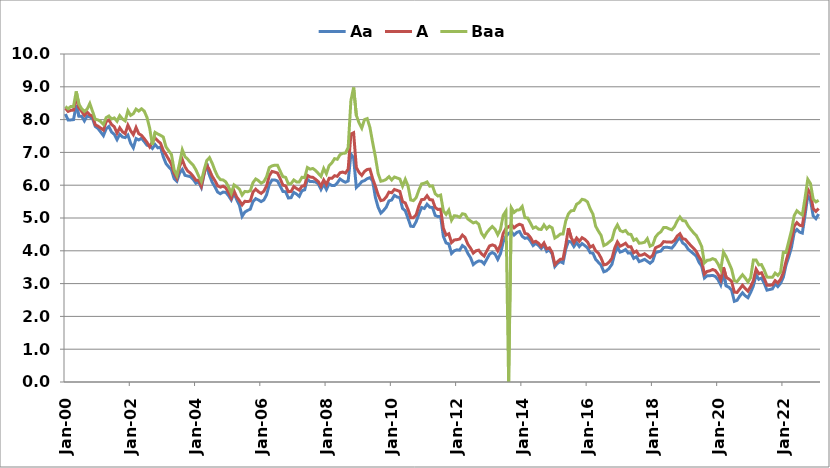
| Category | Aa | A | Baa |
|---|---|---|---|
| 2000-01-01 | 8.17 | 8.35 | 8.4 |
| 2000-02-01 | 7.99 | 8.25 | 8.33 |
| 2000-03-01 | 7.99 | 8.28 | 8.4 |
| 2000-04-01 | 8 | 8.29 | 8.4 |
| 2000-05-01 | 8.44 | 8.7 | 8.86 |
| 2000-06-01 | 8.1 | 8.36 | 8.47 |
| 2000-07-01 | 8.1 | 8.25 | 8.33 |
| 2000-08-01 | 7.96 | 8.13 | 8.25 |
| 2000-09-01 | 8.11 | 8.23 | 8.32 |
| 2000-10-01 | 8.08 | 8.14 | 8.49 |
| 2000-11-01 | 8.03 | 8.11 | 8.25 |
| 2000-12-01 | 7.79 | 7.84 | 8.01 |
| 2001-01-01 | 7.73 | 7.8 | 7.99 |
| 2001-02-01 | 7.62 | 7.74 | 7.94 |
| 2001-03-01 | 7.51 | 7.68 | 7.85 |
| 2001-04-01 | 7.72 | 7.94 | 8.06 |
| 2001-05-01 | 7.79 | 7.99 | 8.11 |
| 2001-06-01 | 7.62 | 7.85 | 8.02 |
| 2001-07-01 | 7.55 | 7.78 | 8.05 |
| 2001-08-01 | 7.39 | 7.59 | 7.95 |
| 2001-09-01 | 7.55 | 7.75 | 8.12 |
| 2001-10-01 | 7.47 | 7.63 | 8.02 |
| 2001-11-01 | 7.45 | 7.57 | 7.96 |
| 2001-12-01 | 7.53 | 7.83 | 8.27 |
| 2002-01-01 | 7.28 | 7.66 | 8.13 |
| 2002-02-01 | 7.14 | 7.54 | 8.18 |
| 2002-03-01 | 7.42 | 7.76 | 8.32 |
| 2002-04-01 | 7.38 | 7.57 | 8.26 |
| 2002-05-01 | 7.43 | 7.52 | 8.33 |
| 2002-06-01 | 7.33 | 7.42 | 8.26 |
| 2002-07-01 | 7.22 | 7.31 | 8.07 |
| 2002-08-01 | 7.2 | 7.17 | 7.74 |
| 2002-09-01 | 7.12 | 7.32 | 7.23 |
| 2002-10-01 | 7.24 | 7.44 | 7.61 |
| 2002-11-01 | 7.14 | 7.35 | 7.56 |
| 2002-12-01 | 7.16 | 7.28 | 7.52 |
| 2003-01-01 | 6.87 | 7.06 | 7.47 |
| 2003-02-01 | 6.66 | 6.93 | 7.17 |
| 2003-03-01 | 6.56 | 6.79 | 7.05 |
| 2003-04-01 | 6.47 | 6.64 | 6.94 |
| 2003-05-01 | 6.2 | 6.36 | 6.47 |
| 2003-06-01 | 6.12 | 6.21 | 6.3 |
| 2003-07-01 | 6.37 | 6.57 | 6.67 |
| 2003-08-01 | 6.48 | 6.78 | 7.08 |
| 2003-09-01 | 6.3 | 6.56 | 6.87 |
| 2003-10-01 | 6.28 | 6.43 | 6.79 |
| 2003-11-01 | 6.26 | 6.37 | 6.69 |
| 2003-12-01 | 6.18 | 6.27 | 6.61 |
| 2004-01-01 | 6.06 | 6.15 | 6.47 |
| 2004-02-01 | 6.1 | 6.15 | 6.28 |
| 2004-03-01 | 5.93 | 5.97 | 6.12 |
| 2004-04-01 | 6.33 | 6.35 | 6.46 |
| 2004-05-01 | 6.66 | 6.62 | 6.75 |
| 2004-06-01 | 6.3 | 6.46 | 6.84 |
| 2004-07-01 | 6.09 | 6.27 | 6.67 |
| 2004-08-01 | 5.95 | 6.14 | 6.45 |
| 2004-09-01 | 5.79 | 5.98 | 6.27 |
| 2004-10-01 | 5.74 | 5.94 | 6.17 |
| 2004-11-01 | 5.79 | 5.97 | 6.16 |
| 2004-12-01 | 5.78 | 5.92 | 6.1 |
| 2005-01-01 | 5.68 | 5.78 | 5.95 |
| 2005-02-01 | 5.55 | 5.61 | 5.76 |
| 2005-03-01 | 5.76 | 5.83 | 6.01 |
| 2005-04-01 | 5.56 | 5.64 | 5.95 |
| 2005-05-01 | 5.39 | 5.53 | 5.88 |
| 2005-06-01 | 5.05 | 5.4 | 5.7 |
| 2005-07-01 | 5.18 | 5.51 | 5.81 |
| 2005-08-01 | 5.23 | 5.5 | 5.8 |
| 2005-09-01 | 5.27 | 5.52 | 5.83 |
| 2005-10-01 | 5.5 | 5.79 | 6.08 |
| 2005-11-01 | 5.59 | 5.88 | 6.19 |
| 2005-12-01 | 5.55 | 5.8 | 6.14 |
| 2006-01-01 | 5.5 | 5.75 | 6.06 |
| 2006-02-01 | 5.55 | 5.82 | 6.11 |
| 2006-03-01 | 5.71 | 5.98 | 6.26 |
| 2006-04-01 | 6.02 | 6.29 | 6.54 |
| 2006-05-01 | 6.16 | 6.42 | 6.59 |
| 2006-06-01 | 6.16 | 6.4 | 6.61 |
| 2006-07-01 | 6.13 | 6.37 | 6.61 |
| 2006-08-01 | 5.97 | 6.2 | 6.43 |
| 2006-09-01 | 5.81 | 6 | 6.26 |
| 2006-10-01 | 5.8 | 5.98 | 6.24 |
| 2006-11-01 | 5.61 | 5.8 | 6.04 |
| 2006-12-01 | 5.62 | 5.81 | 6.05 |
| 2007-01-01 | 5.78 | 5.96 | 6.16 |
| 2007-02-01 | 5.73 | 5.9 | 6.1 |
| 2007-03-01 | 5.66 | 5.85 | 6.1 |
| 2007-04-01 | 5.83 | 5.97 | 6.24 |
| 2007-05-01 | 5.86 | 5.99 | 6.23 |
| 2007-06-01 | 6.18 | 6.3 | 6.54 |
| 2007-07-01 | 6.11 | 6.25 | 6.49 |
| 2007-08-01 | 6.11 | 6.24 | 6.51 |
| 2007-09-01 | 6.1 | 6.18 | 6.45 |
| 2007-10-01 | 6.04 | 6.11 | 6.36 |
| 2007-11-01 | 5.87 | 5.97 | 6.27 |
| 2007-12-01 | 6.03 | 6.16 | 6.51 |
| 2008-01-01 | 5.87 | 6.02 | 6.35 |
| 2008-02-01 | 6.04 | 6.21 | 6.6 |
| 2008-03-01 | 5.99 | 6.21 | 6.68 |
| 2008-04-01 | 5.99 | 6.29 | 6.81 |
| 2008-05-01 | 6.07 | 6.27 | 6.79 |
| 2008-06-01 | 6.19 | 6.38 | 6.93 |
| 2008-07-01 | 6.13 | 6.4 | 6.97 |
| 2008-08-01 | 6.09 | 6.37 | 6.98 |
| 2008-09-01 | 6.13 | 6.49 | 7.15 |
| 2008-10-01 | 6.95 | 7.56 | 8.58 |
| 2008-11-01 | 6.83 | 7.6 | 8.98 |
| 2008-12-01 | 5.93 | 6.54 | 8.13 |
| 2009-01-01 | 6.01 | 6.39 | 7.9 |
| 2009-02-01 | 6.11 | 6.3 | 7.74 |
| 2009-03-01 | 6.14 | 6.42 | 8 |
| 2009-04-01 | 6.2 | 6.48 | 8.03 |
| 2009-05-01 | 6.23 | 6.49 | 7.76 |
| 2009-06-01 | 6.13 | 6.2 | 7.3 |
| 2009-07-01 | 5.63 | 5.97 | 6.87 |
| 2009-08-01 | 5.33 | 5.71 | 6.36 |
| 2009-09-01 | 5.15 | 5.53 | 6.12 |
| 2009-10-01 | 5.23 | 5.55 | 6.14 |
| 2009-11-01 | 5.33 | 5.64 | 6.18 |
| 2009-12-01 | 5.52 | 5.79 | 6.26 |
| 2010-01-01 | 5.55 | 5.77 | 6.16 |
| 2010-02-01 | 5.69 | 5.87 | 6.25 |
| 2010-03-01 | 5.64 | 5.84 | 6.22 |
| 2010-04-01 | 5.62 | 5.81 | 6.19 |
| 2010-05-01 | 5.29 | 5.5 | 5.97 |
| 2010-06-01 | 5.22 | 5.46 | 6.18 |
| 2010-07-01 | 4.99 | 5.26 | 5.98 |
| 2010-08-01 | 4.75 | 5.01 | 5.55 |
| 2010-09-01 | 4.74 | 5.01 | 5.53 |
| 2010-10-01 | 4.89 | 5.1 | 5.62 |
| 2010-11-01 | 5.12 | 5.37 | 5.85 |
| 2010-12-01 | 5.32 | 5.56 | 6.04 |
| 2011-01-01 | 5.29 | 5.57 | 6.06 |
| 2011-02-01 | 5.42 | 5.68 | 6.1 |
| 2011-03-01 | 5.33 | 5.56 | 5.97 |
| 2011-04-01 | 5.32 | 5.55 | 5.98 |
| 2011-05-01 | 5.08 | 5.32 | 5.74 |
| 2011-06-01 | 5.04 | 5.26 | 5.67 |
| 2011-07-01 | 5.05 | 5.27 | 5.7 |
| 2011-08-01 | 4.44 | 4.69 | 5.22 |
| 2011-09-01 | 4.24 | 4.48 | 5.11 |
| 2011-10-01 | 4.21 | 4.52 | 5.24 |
| 2011-11-01 | 3.92 | 4.25 | 4.93 |
| 2011-12-01 | 4 | 4.33 | 5.07 |
| 2012-01-01 | 4.03 | 4.34 | 5.06 |
| 2012-02-01 | 4.02 | 4.36 | 5.02 |
| 2012-03-01 | 4.16 | 4.48 | 5.13 |
| 2012-04-01 | 4.1 | 4.4 | 5.11 |
| 2012-05-01 | 3.92 | 4.2 | 4.97 |
| 2012-06-01 | 3.79 | 4.08 | 4.91 |
| 2012-07-01 | 3.58 | 3.93 | 4.85 |
| 2012-08-01 | 3.65 | 4 | 4.88 |
| 2012-09-01 | 3.69 | 4.02 | 4.81 |
| 2012-10-01 | 3.68 | 3.91 | 4.54 |
| 2012-11-01 | 3.6 | 3.84 | 4.42 |
| 2012-12-01 | 3.75 | 4 | 4.56 |
| 2013-01-01 | 3.9 | 4.15 | 4.66 |
| 2013-02-01 | 3.95 | 4.18 | 4.74 |
| 2013-03-01 | 3.9 | 4.15 | 4.66 |
| 2013-04-01 | 3.74 | 4 | 4.49 |
| 2013-05-01 | 3.91 | 4.17 | 4.65 |
| 2013-06-01 | 4.27 | 4.53 | 5.08 |
| 2013-07-01 | 4.44 | 4.68 | 5.21 |
| 2013-08-01 | 4.53 | 4.73 | 0 |
| 2013-09-01 | 4.58 | 4.8 | 5.31 |
| 2013-10-01 | 4.48 | 4.7 | 5.17 |
| 2013-11-01 | 4.56 | 4.77 | 5.24 |
| 2013-12-01 | 4.59 | 4.81 | 5.25 |
| 2014-01-01 | 4.44 | 4.778 | 5.351 |
| 2014-02-01 | 4.38 | 4.53 | 5.01 |
| 2014-03-01 | 4.4 | 4.51 | 5 |
| 2014-04-01 | 4.3 | 4.41 | 4.85 |
| 2014-05-01 | 4.16 | 4.26 | 4.69 |
| 2014-06-01 | 4.23 | 4.29 | 4.73 |
| 2014-07-01 | 4.16 | 4.23 | 4.66 |
| 2014-08-01 | 4.07 | 4.13 | 4.65 |
| 2014-09-01 | 4.18 | 4.24 | 4.79 |
| 2014-10-01 | 3.98 | 4.06 | 4.67 |
| 2014-11-01 | 4.03 | 4.09 | 4.75 |
| 2014-12-01 | 3.9 | 3.95 | 4.7 |
| 2015-01-01 | 3.52 | 3.58 | 4.39 |
| 2015-02-01 | 3.62 | 3.67 | 4.44 |
| 2015-03-01 | 3.67 | 3.74 | 4.51 |
| 2015-04-01 | 3.63 | 3.75 | 4.51 |
| 2015-05-01 | 4.05 | 4.17 | 4.91 |
| 2015-06-01 | 4.29 | 4.69 | 5.13 |
| 2015-07-01 | 4.27 | 4.4 | 5.22 |
| 2015-08-01 | 4.13 | 4.25 | 5.23 |
| 2015-09-01 | 4.25 | 4.39 | 5.42 |
| 2015-10-01 | 4.13 | 4.29 | 5.47 |
| 2015-11-01 | 4.22 | 4.4 | 5.57 |
| 2015-12-01 | 4.16 | 4.35 | 5.55 |
| 2016-01-01 | 4.09 | 4.27 | 5.49 |
| 2016-02-01 | 3.94 | 4.11 | 5.28 |
| 2016-03-01 | 3.93 | 4.16 | 5.12 |
| 2016-04-01 | 3.74 | 4 | 4.75 |
| 2016-05-01 | 3.65 | 3.93 | 4.6 |
| 2016-06-01 | 3.56 | 3.78 | 4.47 |
| 2016-07-01 | 3.36 | 3.57 | 4.16 |
| 2016-08-01 | 3.39 | 3.59 | 4.2 |
| 2016-09-01 | 3.47 | 3.66 | 4.27 |
| 2016-10-01 | 3.59 | 3.77 | 4.34 |
| 2016-11-01 | 3.91 | 4.08 | 4.64 |
| 2016-12-01 | 4.11 | 4.27 | 4.79 |
| 2017-01-01 | 3.96 | 4.14 | 4.62 |
| 2017-02-01 | 3.99 | 4.18 | 4.58 |
| 2017-03-01 | 4.04 | 4.23 | 4.62 |
| 2017-04-01 | 3.93 | 4.12 | 4.51 |
| 2017-05-01 | 3.94 | 4.12 | 4.5 |
| 2017-06-01 | 3.77 | 3.94 | 4.32 |
| 2017-07-01 | 3.82 | 3.99 | 4.36 |
| 2017-08-01 | 3.67 | 3.86 | 4.23 |
| 2017-09-01 | 3.7 | 3.87 | 4.24 |
| 2017-10-01 | 3.74 | 3.91 | 4.26 |
| 2017-11-01 | 3.68 | 3.85 | 4.37 |
| 2017-12-01 | 3.62 | 3.79 | 4.14 |
| 2018-01-01 | 3.69 | 3.86 | 4.18 |
| 2018-02-01 | 3.94 | 4.09 | 4.42 |
| 2018-03-01 | 3.97 | 4.13 | 4.52 |
| 2018-04-01 | 3.99 | 4.17 | 4.58 |
| 2018-05-01 | 4.1 | 4.28 | 4.71 |
| 2018-06-01 | 4.11 | 4.27 | 4.71 |
| 2018-07-01 | 4.1 | 4.27 | 4.67 |
| 2018-08-01 | 4.08 | 4.26 | 4.64 |
| 2018-09-01 | 4.18 | 4.32 | 4.74 |
| 2018-10-01 | 4.31 | 4.45 | 4.91 |
| 2018-11-01 | 4.4 | 4.52 | 5.03 |
| 2018-12-01 | 4.24 | 4.37 | 4.92 |
| 2019-01-01 | 4.18 | 4.35 | 4.91 |
| 2019-02-01 | 4.05 | 4.25 | 4.76 |
| 2019-03-01 | 3.98 | 4.16 | 4.65 |
| 2019-04-01 | 3.91 | 4.08 | 4.55 |
| 2019-05-01 | 3.84 | 3.98 | 4.47 |
| 2019-06-01 | 3.65 | 3.82 | 4.31 |
| 2019-07-01 | 3.53 | 3.69 | 4.13 |
| 2019-08-01 | 3.17 | 3.29 | 3.63 |
| 2019-09-01 | 3.24 | 3.37 | 3.71 |
| 2019-10-01 | 3.24 | 3.39 | 3.72 |
| 2019-11-01 | 3.25 | 3.43 | 3.76 |
| 2019-12-01 | 3.22 | 3.4 | 3.73 |
| 2020-01-01 | 3.12 | 3.29 | 3.6 |
| 2020-02-01 | 2.96 | 3.11 | 3.42 |
| 2020-03-01 | 3.3 | 3.5 | 3.96 |
| 2020-04-01 | 2.93 | 3.19 | 3.82 |
| 2020-05-01 | 2.89 | 3.14 | 3.63 |
| 2020-06-01 | 2.8 | 3.07 | 3.44 |
| 2020-07-01 | 2.46 | 2.74 | 3.09 |
| 2020-08-01 | 2.49 | 2.73 | 3.06 |
| 2020-09-01 | 2.62 | 2.84 | 3.17 |
| 2020-10-01 | 2.72 | 2.95 | 3.27 |
| 2020-11-01 | 2.63 | 2.85 | 3.17 |
| 2020-12-01 | 2.57 | 2.77 | 3.05 |
| 2021-01-01 | 2.73 | 2.91 | 3.18 |
| 2021-02-01 | 2.93 | 3.09 | 3.72 |
| 2021-03-01 | 3.27 | 3.44 | 3.72 |
| 2021-04-01 | 3.13 | 3.3 | 3.57 |
| 2021-05-01 | 3.17 | 3.33 | 3.58 |
| 2021-06-01 | 3.01 | 3.16 | 3.41 |
| 2021-07-01 | 2.8 | 2.95 | 3.2 |
| 2021-08-01 | 2.82 | 2.95 | 3.19 |
| 2021-09-01 | 2.84 | 2.96 | 3.19 |
| 2021-10-01 | 2.99 | 3.09 | 3.32 |
| 2021-11-01 | 2.91 | 3.02 | 3.25 |
| 2021-12-01 | 3.01 | 3.13 | 3.35 |
| 2022-01-01 | 3.19 | 3.33 | 3.95 |
| 2022-02-01 | 3.56 | 3.68 | 3.95 |
| 2022-03-01 | 3.81 | 3.98 | 4.28 |
| 2022-04-01 | 4.1 | 4.32 | 4.61 |
| 2022-05-01 | 4.55 | 4.75 | 5.07 |
| 2022-06-01 | 4.65 | 4.86 | 5.22 |
| 2022-07-01 | 4.57 | 4.78 | 5.15 |
| 2022-08-01 | 4.54 | 4.76 | 5.09 |
| 2022-09-01 | 5.08 | 5.28 | 5.61 |
| 2022-10-01 | 5.68 | 5.88 | 6.18 |
| 2022-11-01 | 5.54 | 5.75 | 6.05 |
| 2022-12-01 | 5.06 | 5.28 | 5.57 |
| 2023-01-01 | 4.98 | 5.2 | 5.49 |
| 2023-02-01 | 5.12 | 5.29 | 5.54 |